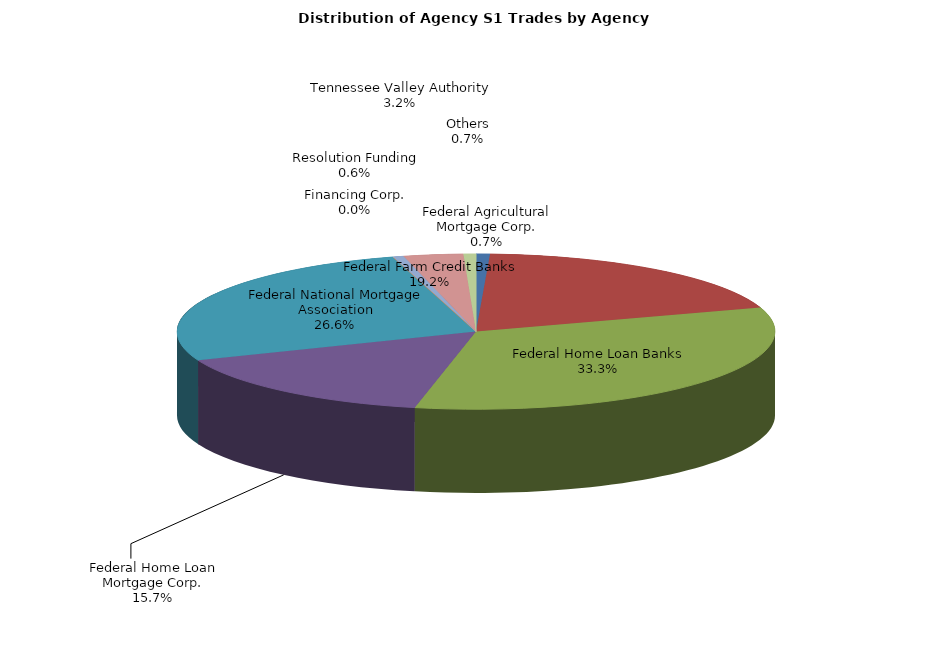
| Category | Series 0 |
|---|---|
| Federal Agricultural Mortgage Corp. | 11.369 |
| Federal Farm Credit Banks | 291.81 |
| Federal Home Loan Banks | 505.567 |
| Federal Home Loan Mortgage Corp. | 238.012 |
| Federal National Mortgage Association | 403.353 |
| Financing Corp. | 0 |
| Resolution Funding | 8.837 |
| Tennessee Valley Authority | 48.861 |
| Others | 10.21 |